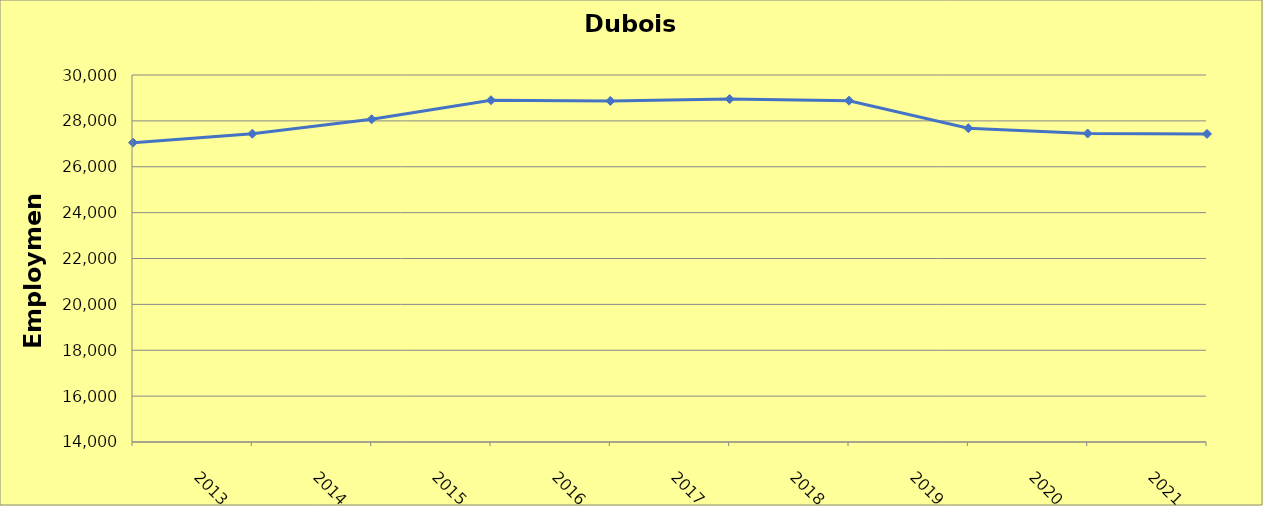
| Category | Dubois County |
|---|---|
| 2013.0 | 27050 |
| 2014.0 | 27440 |
| 2015.0 | 28070 |
| 2016.0 | 28900 |
| 2017.0 | 28870 |
| 2018.0 | 28950 |
| 2019.0 | 28880 |
| 2020.0 | 27680 |
| 2021.0 | 27450 |
| 2022.0 | 27431 |